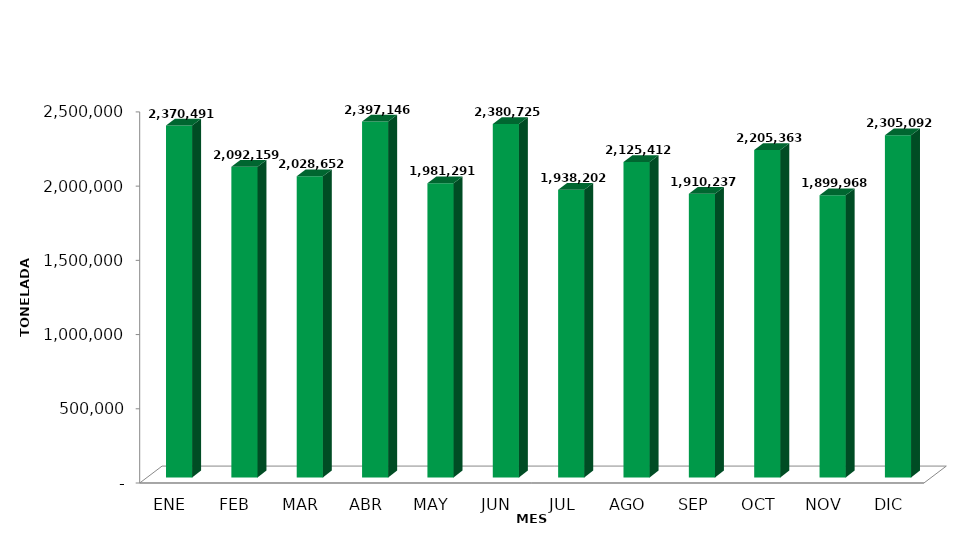
| Category | Series 0 |
|---|---|
| ENE | 2370491.257 |
| FEB | 2092158.686 |
| MAR | 2028652.471 |
| ABR | 2397145.609 |
| MAY | 1981290.645 |
| JUN | 2380725.22 |
| JUL | 1938202.433 |
| AGO | 2125412.427 |
| SEP | 1910237.392 |
| OCT | 2205362.609 |
| NOV | 1899968.336 |
| DIC | 2305091.857 |